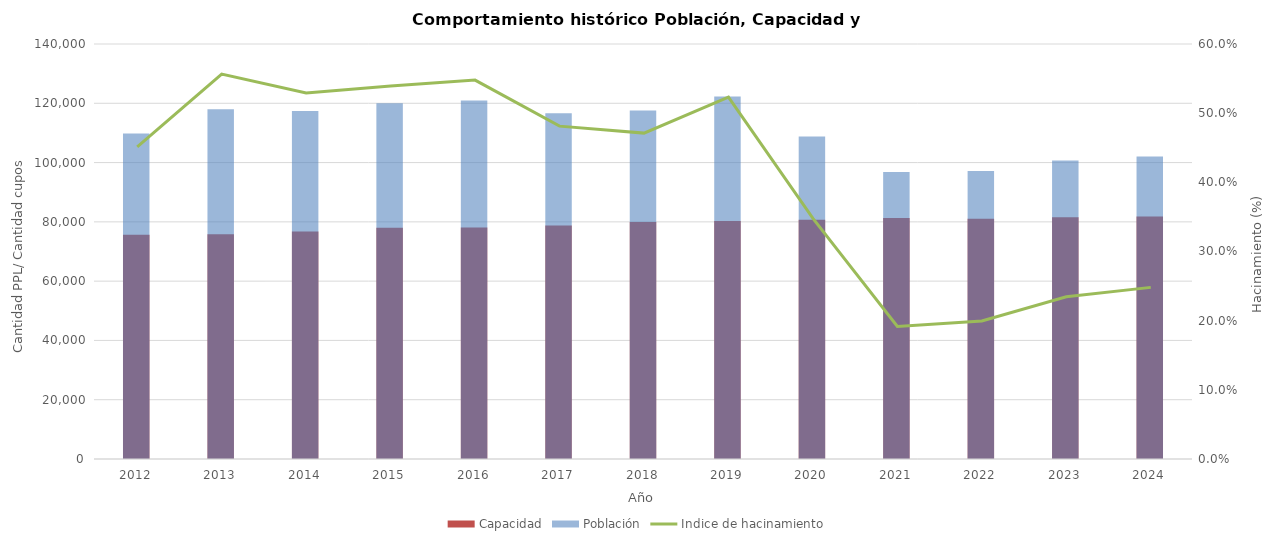
| Category | Capacidad | Población |
|---|---|---|
| 2012.0 | 75679.167 | 109822.083 |
| 2013.0 | 75796.583 | 117986.5 |
| 2014.0 | 76777 | 117389.083 |
| 2015.0 | 77979.75 | 120040.083 |
| 2016.0 | 78119.5 | 120914 |
| 2017.0 | 78759 | 116657.667 |
| 2018.0 | 79914 | 117569.583 |
| 2019.0 | 80296.167 | 122309.5 |
| 2020.0 | 80704.167 | 108777.75 |
| 2021.0 | 81268.833 | 96837.5 |
| 2022.0 | 81010.417 | 97175.917 |
| 2023.0 | 81594 | 100737.75 |
| 2024.0 | 81779.2 | 102072 |